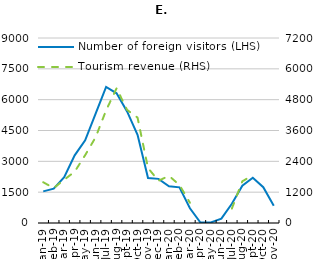
| Category | Number of foreign visitors (LHS) |
|---|---|
| 2019-01-01 | 1539.496 |
| 2019-02-01 | 1670.238 |
| 2019-03-01 | 2232.358 |
| 2019-04-01 | 3293.176 |
| 2019-05-01 | 4022.254 |
| 2019-06-01 | 5318.984 |
| 2019-07-01 | 6617.38 |
| 2019-08-01 | 6307.508 |
| 2019-09-01 | 5426.818 |
| 2019-10-01 | 4291.574 |
| 2019-11-01 | 2190.622 |
| 2019-12-01 | 2147.878 |
| 2020-01-01 | 1787.435 |
| 2020-02-01 | 1733.112 |
| 2020-03-01 | 718.097 |
| 2020-04-01 | 24.238 |
| 2020-05-01 | 29.829 |
| 2020-06-01 | 214.768 |
| 2020-07-01 | 932.927 |
| 2020-08-01 | 1814.701 |
| 2020-09-01 | 2203.482 |
| 2020-10-01 | 1742.303 |
| 2020-11-01 | 833.991 |